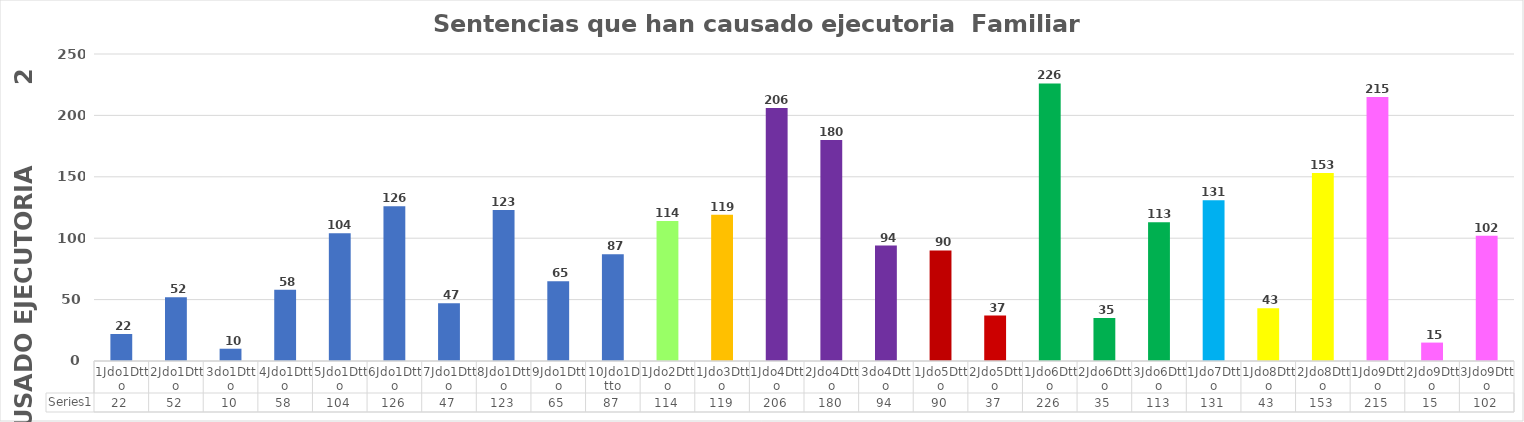
| Category | Series 0 |
|---|---|
| 1Jdo1Dtto | 22 |
| 2Jdo1Dtto | 52 |
| 3do1Dtto | 10 |
| 4Jdo1Dtto | 58 |
| 5Jdo1Dtto | 104 |
| 6Jdo1Dtto | 126 |
| 7Jdo1Dtto | 47 |
| 8Jdo1Dtto | 123 |
| 9Jdo1Dtto | 65 |
| 10Jdo1Dtto | 87 |
| 1Jdo2Dtto | 114 |
| 1Jdo3Dtto | 119 |
| 1Jdo4Dtto | 206 |
| 2Jdo4Dtto | 180 |
| 3do4Dtto | 94 |
| 1Jdo5Dtto | 90 |
| 2Jdo5Dtto | 37 |
| 1Jdo6Dtto | 226 |
| 2Jdo6Dtto | 35 |
| 3Jdo6Dtto | 113 |
| 1Jdo7Dtto | 131 |
| 1Jdo8Dtto | 43 |
| 2Jdo8Dtto | 153 |
| 1Jdo9Dtto | 215 |
| 2Jdo9Dtto | 15 |
| 3Jdo9Dtto | 102 |